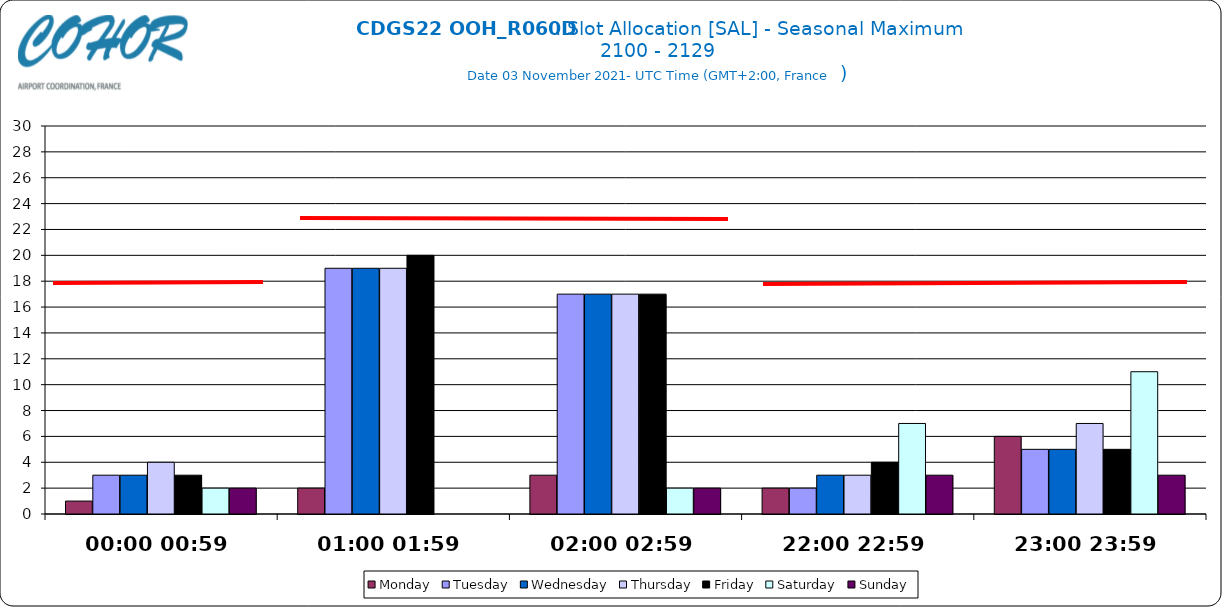
| Category | Monday | Tuesday | Wednesday | Thursday | Friday | Saturday | Sunday |
|---|---|---|---|---|---|---|---|
| 00:00 00:59 | 1 | 3 | 3 | 4 | 3 | 2 | 2 |
| 01:00 01:59 | 2 | 19 | 19 | 19 | 20 | 0 | 0 |
| 02:00 02:59 | 3 | 17 | 17 | 17 | 17 | 2 | 2 |
| 22:00 22:59 | 2 | 2 | 3 | 3 | 4 | 7 | 3 |
| 23:00 23:59 | 6 | 5 | 5 | 7 | 5 | 11 | 3 |